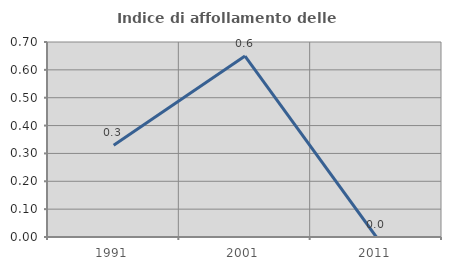
| Category | Indice di affollamento delle abitazioni  |
|---|---|
| 1991.0 | 0.329 |
| 2001.0 | 0.649 |
| 2011.0 | 0 |